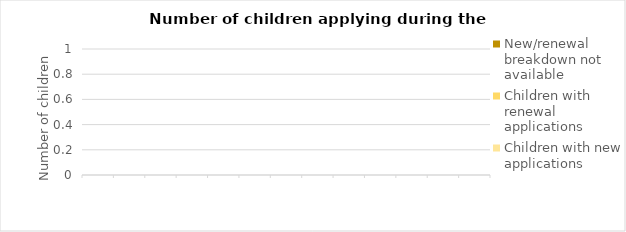
| Category | Children with new applications | Children with renewal applications | New/renewal breakdown not available |
|---|---|---|---|
|  | 0 | 0 | 0 |
|  | 0 | 0 | 0 |
|  | 0 | 0 | 0 |
|  | 0 | 0 | 0 |
|  | 0 | 0 | 0 |
|  | 0 | 0 | 0 |
|  | 0 | 0 | 0 |
|  | 0 | 0 | 0 |
|  | 0 | 0 | 0 |
|  | 0 | 0 | 0 |
|  | 0 | 0 | 0 |
|  | 0 | 0 | 0 |
|  | 0 | 0 | 0 |